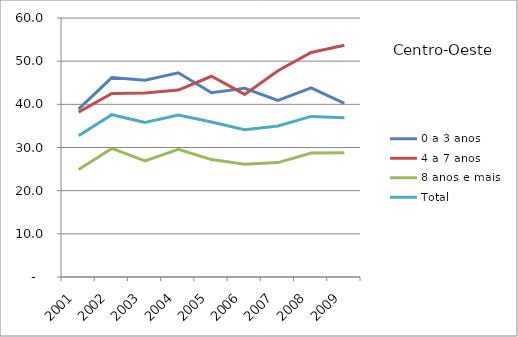
| Category | 0 a 3 anos | 4 a 7 anos | 8 anos e mais | Total |
|---|---|---|---|---|
| 2001.0 | 38.9 | 38.2 | 24.9 | 32.7 |
| 2002.0 | 46.2 | 42.5 | 29.8 | 37.6 |
| 2003.0 | 45.6 | 42.6 | 26.9 | 35.8 |
| 2004.0 | 47.3 | 43.3 | 29.6 | 37.5 |
| 2005.0 | 42.7 | 46.5 | 27.2 | 35.9 |
| 2006.0 | 43.7 | 42.3 | 26.1 | 34.1 |
| 2007.0 | 40.9 | 47.8 | 26.5 | 35 |
| 2008.0 | 43.8 | 52 | 28.7 | 37.2 |
| 2009.0 | 40.2 | 53.7 | 28.8 | 36.9 |